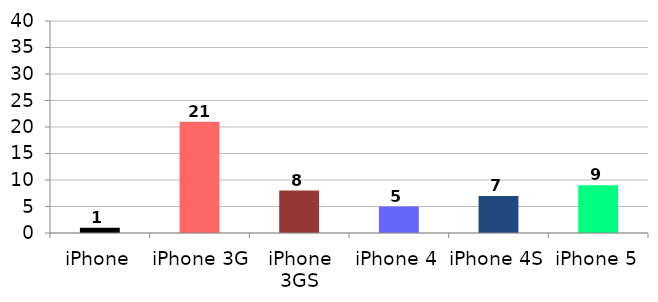
| Category | Series 0 |
|---|---|
| iPhone | 1 |
| iPhone 3G | 21 |
| iPhone 3GS | 8 |
| iPhone 4 | 5 |
| iPhone 4S | 7 |
| iPhone 5 | 9 |